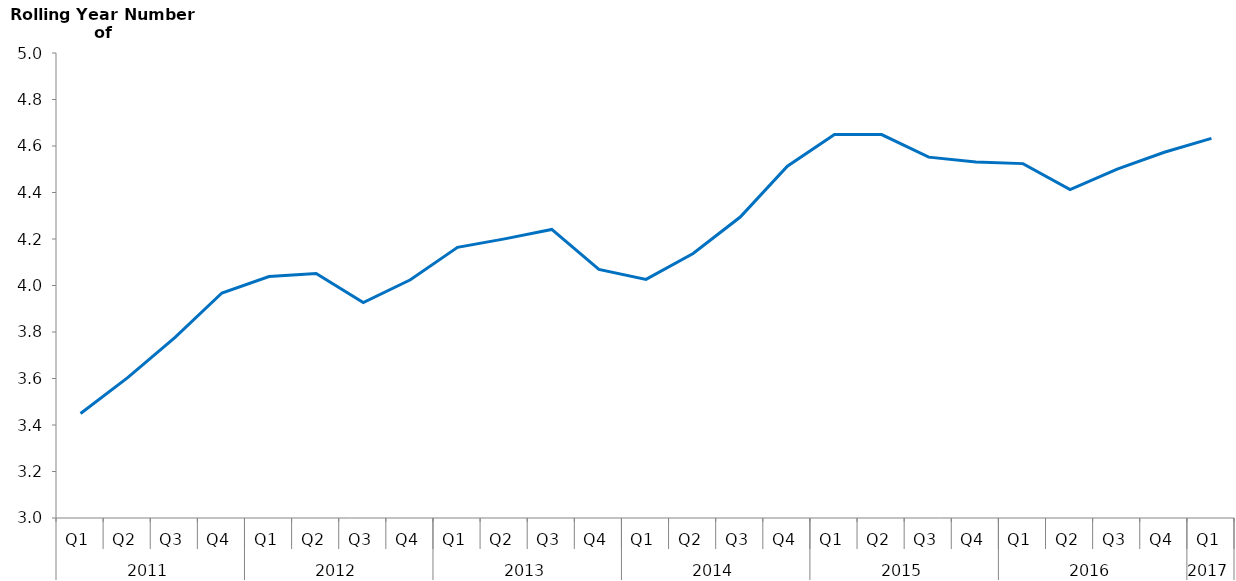
| Category | Rolling Year Overnight Trips  |
|---|---|
| 0 | 3449234.585 |
| 1 | 3603503.025 |
| 2 | 3776061.835 |
| 3 | 3967762.023 |
| 4 | 4038429.282 |
| 5 | 4051615.143 |
| 6 | 3926598.037 |
| 7 | 4024504.999 |
| 8 | 4164220.885 |
| 9 | 4200581.796 |
| 10 | 4241056.555 |
| 11 | 4069440.424 |
| 12 | 4026459.687 |
| 13 | 4137374.729 |
| 14 | 4294428.3 |
| 15 | 4513146.4 |
| 16 | 4649933.446 |
| 17 | 4649322.249 |
| 18 | 4552115.024 |
| 19 | 4531617.984 |
| 20 | 4524205.299 |
| 21 | 4412394.417 |
| 22 | 4500506.255 |
| 23 | 4572940.408 |
| 24 | 4632852.43 |